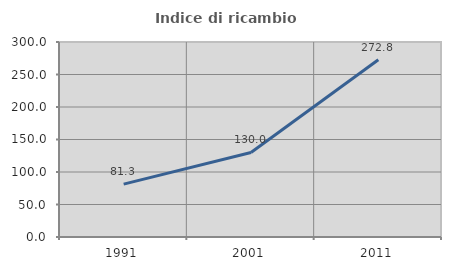
| Category | Indice di ricambio occupazionale  |
|---|---|
| 1991.0 | 81.284 |
| 2001.0 | 130.025 |
| 2011.0 | 272.769 |